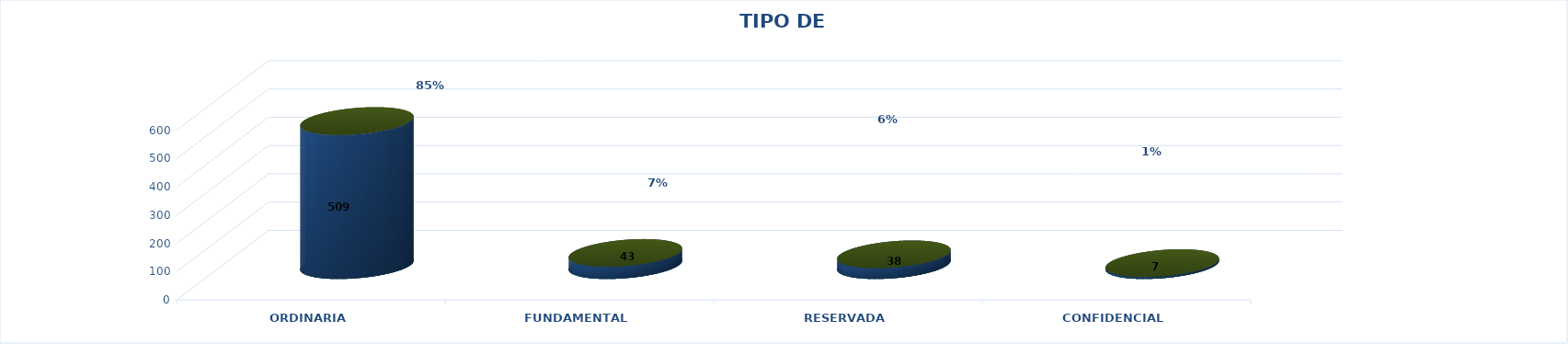
| Category | Series 0 | Series 2 | Series 1 | Series 3 | Series 4 |
|---|---|---|---|---|---|
| ORDINARIA |  |  |  | 509 | 0.853 |
| FUNDAMENTAL |  |  |  | 43 | 0.072 |
| RESERVADA |  |  |  | 38 | 0.064 |
| CONFIDENCIAL |  |  |  | 7 | 0.012 |